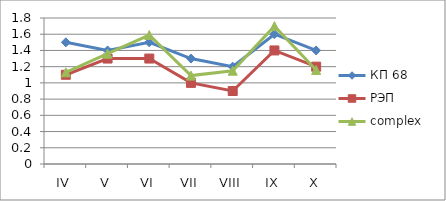
| Category | КП 68 | РЭП  | complex |
|---|---|---|---|
| IV | 1.5 | 1.1 | 1.13 |
| V | 1.4 | 1.3 | 1.36 |
| VI | 1.5 | 1.3 | 1.59 |
| VII | 1.3 | 1 | 1.09 |
| VIII | 1.2 | 0.9 | 1.15 |
| IX | 1.6 | 1.4 | 1.7 |
| X | 1.4 | 1.2 | 1.16 |